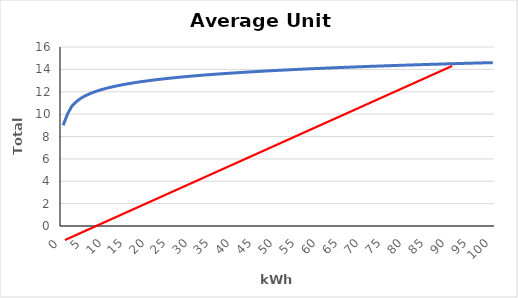
| Category | Series 0 |
|---|---|
| 0.0 | 9 |
| 1.0 | 10 |
| 2.0 | 10.693 |
| 3.0 | 11.099 |
| 4.0 | 11.386 |
| 5.0 | 11.609 |
| 6.0 | 11.792 |
| 7.0 | 11.946 |
| 8.0 | 12.079 |
| 9.0 | 12.197 |
| 10.0 | 12.303 |
| 11.0 | 12.398 |
| 12.0 | 12.485 |
| 13.0 | 12.565 |
| 14.0 | 12.639 |
| 15.0 | 12.708 |
| 16.0 | 12.773 |
| 17.0 | 12.833 |
| 18.0 | 12.89 |
| 19.0 | 12.944 |
| 20.0 | 12.996 |
| 21.0 | 13.045 |
| 22.0 | 13.091 |
| 23.0 | 13.135 |
| 24.0 | 13.178 |
| 25.0 | 13.219 |
| 26.0 | 13.258 |
| 27.0 | 13.296 |
| 28.0 | 13.332 |
| 29.0 | 13.367 |
| 30.0 | 13.401 |
| 31.0 | 13.434 |
| 32.0 | 13.466 |
| 33.0 | 13.497 |
| 34.0 | 13.526 |
| 35.0 | 13.555 |
| 36.0 | 13.584 |
| 37.0 | 13.611 |
| 38.0 | 13.638 |
| 39.0 | 13.664 |
| 40.0 | 13.689 |
| 41.0 | 13.714 |
| 42.0 | 13.738 |
| 43.0 | 13.761 |
| 44.0 | 13.784 |
| 45.0 | 13.807 |
| 46.0 | 13.829 |
| 47.0 | 13.85 |
| 48.0 | 13.871 |
| 49.0 | 13.892 |
| 50.0 | 13.912 |
| 51.0 | 13.932 |
| 52.0 | 13.951 |
| 53.0 | 13.97 |
| 54.0 | 13.989 |
| 55.0 | 14.007 |
| 56.0 | 14.025 |
| 57.0 | 14.043 |
| 58.0 | 14.06 |
| 59.0 | 14.078 |
| 60.0 | 14.094 |
| 61.0 | 14.111 |
| 62.0 | 14.127 |
| 63.0 | 14.143 |
| 64.0 | 14.159 |
| 65.0 | 14.174 |
| 66.0 | 14.19 |
| 67.0 | 14.205 |
| 68.0 | 14.22 |
| 69.0 | 14.234 |
| 70.0 | 14.248 |
| 71.0 | 14.263 |
| 72.0 | 14.277 |
| 73.0 | 14.29 |
| 74.0 | 14.304 |
| 75.0 | 14.317 |
| 76.0 | 14.331 |
| 77.0 | 14.344 |
| 78.0 | 14.357 |
| 79.0 | 14.369 |
| 80.0 | 14.382 |
| 81.0 | 14.394 |
| 82.0 | 14.407 |
| 83.0 | 14.419 |
| 84.0 | 14.431 |
| 85.0 | 14.443 |
| 86.0 | 14.454 |
| 87.0 | 14.466 |
| 88.0 | 14.477 |
| 89.0 | 14.489 |
| 90.0 | 14.5 |
| 91.0 | 14.511 |
| 92.0 | 14.522 |
| 93.0 | 14.533 |
| 94.0 | 14.543 |
| 95.0 | 14.554 |
| 96.0 | 14.564 |
| 97.0 | 14.575 |
| 98.0 | 14.585 |
| 99.0 | 14.595 |
| 100.0 | 14.605 |